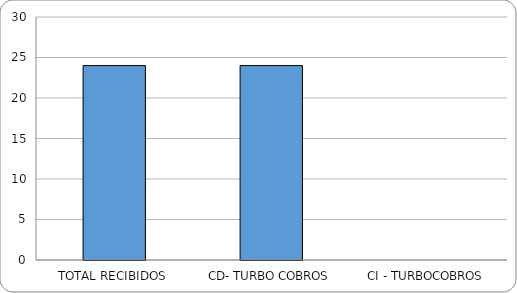
| Category | Series 0 |
|---|---|
| TOTAL RECIBIDOS | 24 |
| CD- TURBO COBROS | 24 |
| CI - TURBOCOBROS | 0 |